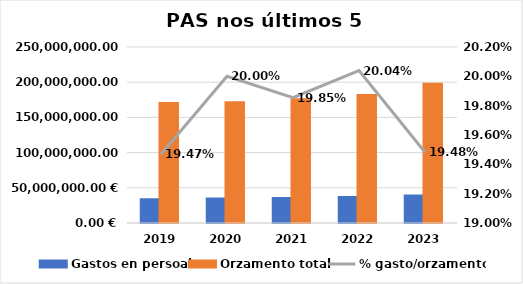
| Category | Gastos en persoal | Orzamento total |
|---|---|---|
| 2019.0 | 33041828.83 | 169720733.3 |
| 2020.0 | 34136555.31 | 170681126.09 |
| 2021.0 | 34770547.71 | 175131206.4 |
| 2022.0 | 36267915.09 | 180980048.67 |
| 2023.0 | 38403765.62 | 197117035 |